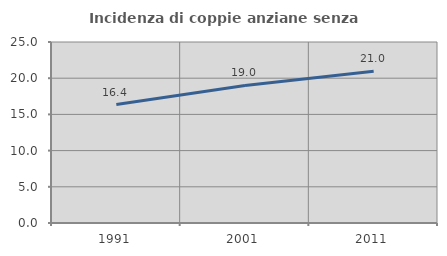
| Category | Incidenza di coppie anziane senza figli  |
|---|---|
| 1991.0 | 16.355 |
| 2001.0 | 19 |
| 2011.0 | 20.968 |